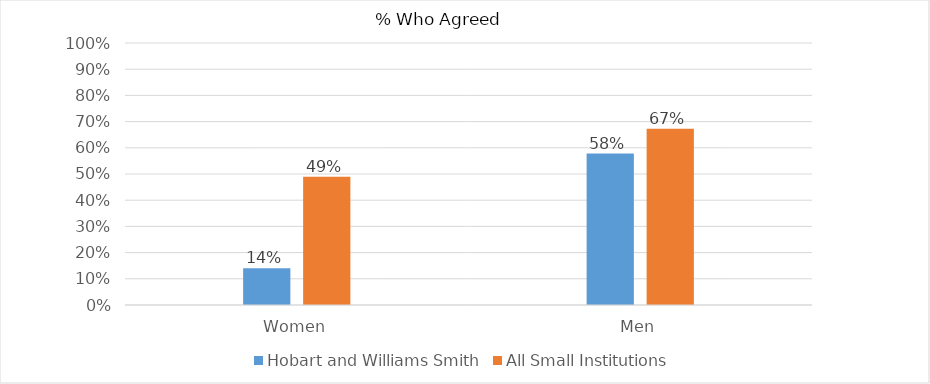
| Category | Hobart and Williams Smith | All Small Institutions |
|---|---|---|
| Women | 0.14 | 0.489 |
| Men | 0.578 | 0.673 |